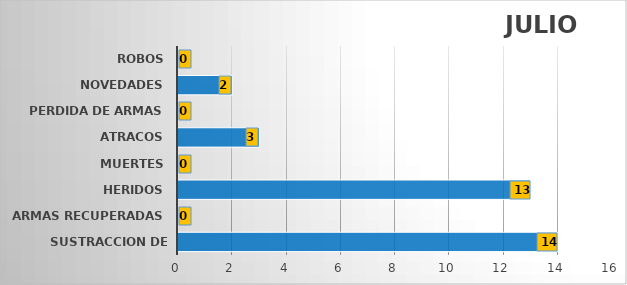
| Category | Series 1 |
|---|---|
| SUSTRACCION DE ARMAS | 14 |
| ARMAS RECUPERADAS | 0 |
| HERIDOS | 13 |
| MUERTES | 0 |
| ATRACOS | 3 |
| PERDIDA DE ARMAS | 0 |
| NOVEDADES | 2 |
| ROBOS | 0 |